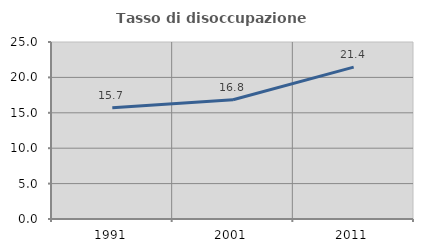
| Category | Tasso di disoccupazione giovanile  |
|---|---|
| 1991.0 | 15.722 |
| 2001.0 | 16.845 |
| 2011.0 | 21.449 |